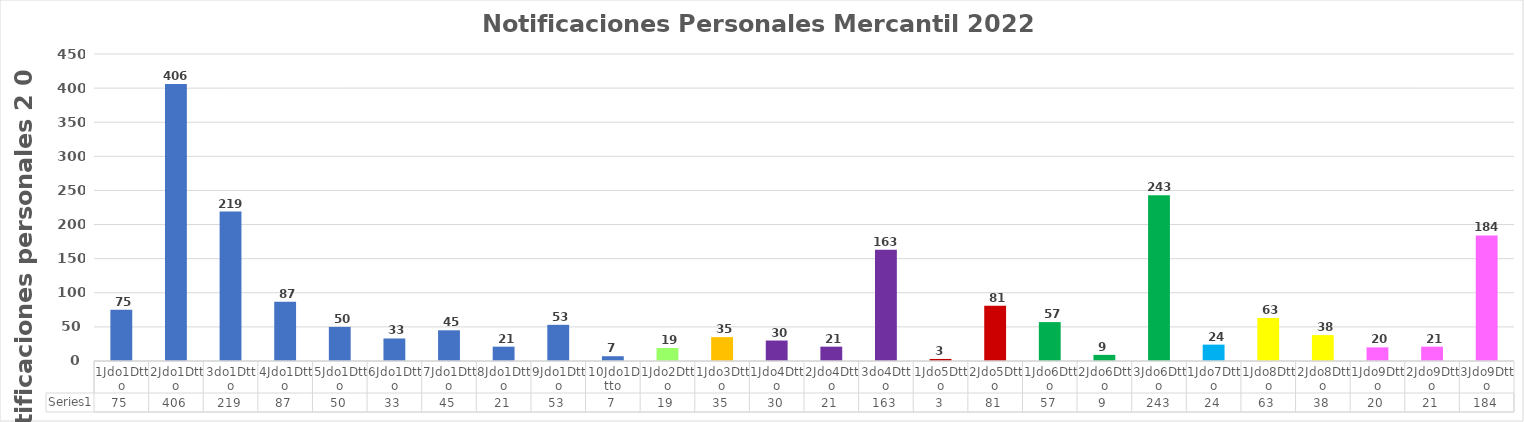
| Category | Series 0 |
|---|---|
| 1Jdo1Dtto | 75 |
| 2Jdo1Dtto | 406 |
| 3do1Dtto | 219 |
| 4Jdo1Dtto | 87 |
| 5Jdo1Dtto | 50 |
| 6Jdo1Dtto | 33 |
| 7Jdo1Dtto | 45 |
| 8Jdo1Dtto | 21 |
| 9Jdo1Dtto | 53 |
| 10Jdo1Dtto | 7 |
| 1Jdo2Dtto | 19 |
| 1Jdo3Dtto | 35 |
| 1Jdo4Dtto | 30 |
| 2Jdo4Dtto | 21 |
| 3do4Dtto | 163 |
| 1Jdo5Dtto | 3 |
| 2Jdo5Dtto | 81 |
| 1Jdo6Dtto | 57 |
| 2Jdo6Dtto | 9 |
| 3Jdo6Dtto | 243 |
| 1Jdo7Dtto | 24 |
| 1Jdo8Dtto | 63 |
| 2Jdo8Dtto | 38 |
| 1Jdo9Dtto | 20 |
| 2Jdo9Dtto | 21 |
| 3Jdo9Dtto | 184 |